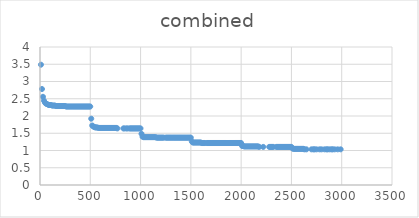
| Category | Series 0 |
|---|---|
| 9.49 | 3.487 |
| 19.54 | 2.782 |
| 29.48 | 2.556 |
| 39.42 | 2.444 |
| 49.49 | 2.387 |
| 59.43 | 2.359 |
| 69.49 | 2.345 |
| 79.43 | 2.331 |
| 89.5 | 2.317 |
| 99.43 | 2.317 |
| 109.5 | 2.317 |
| 119.44 | 2.303 |
| 129.51 | 2.303 |
| 139.45 | 2.303 |
| 149.52 | 2.303 |
| 159.45 | 2.289 |
| 169.51 | 2.289 |
| 179.45 | 2.289 |
| 189.52 | 2.289 |
| 199.45 | 2.289 |
| 209.52 | 2.289 |
| 219.46 | 2.289 |
| 229.52 | 2.289 |
| 239.46 | 2.289 |
| 249.52 | 2.289 |
| 259.48 | 2.275 |
| 269.53 | 2.275 |
| 279.48 | 2.275 |
| 289.42 | 2.275 |
| 299.48 | 2.275 |
| 309.42 | 2.275 |
| 319.49 | 2.275 |
| 329.42 | 2.275 |
| 339.49 | 2.275 |
| 349.42 | 2.275 |
| 359.5 | 2.275 |
| 369.43 | 2.275 |
| 379.5 | 2.275 |
| 389.43 | 2.275 |
| 399.5 | 2.275 |
| 409.44 | 2.275 |
| 419.51 | 2.275 |
| 429.45 | 2.275 |
| 439.51 | 2.275 |
| 449.45 | 2.275 |
| 459.51 | 2.275 |
| 469.45 | 2.275 |
| 479.52 | 2.275 |
| 489.46 | 2.275 |
| 499.53 | 2.275 |
| 509.44 | 1.922 |
| 519.43 | 1.725 |
| 529.43 | 1.696 |
| 539.45 | 1.682 |
| 549.46 | 1.668 |
| 559.41 | 1.668 |
| 569.42 | 1.668 |
| 579.43 | 1.654 |
| 589.45 | 1.654 |
| 599.45 | 1.654 |
| 609.47 | 1.654 |
| 619.41 | 1.654 |
| 629.43 | 1.654 |
| 639.44 | 1.654 |
| 649.46 | 1.654 |
| 659.46 | 1.654 |
| 669.48 | 1.654 |
| 679.43 | 1.654 |
| 689.45 | 1.654 |
| 699.45 | 1.654 |
| 709.47 | 1.654 |
| 719.41 | 1.654 |
| 729.43 | 1.654 |
| 739.45 | 1.654 |
| 749.45 | 1.654 |
| 759.47 | 1.654 |
| 769.41 | 1.64 |
| 829.43 | 1.64 |
| 839.44 | 1.64 |
| 859.46 | 1.64 |
| 869.42 | 1.64 |
| 889.44 | 1.64 |
| 899.47 | 1.64 |
| 909.46 | 1.64 |
| 919.41 | 1.64 |
| 929.43 | 1.64 |
| 939.44 | 1.64 |
| 949.45 | 1.64 |
| 959.46 | 1.64 |
| 969.41 | 1.64 |
| 979.42 | 1.64 |
| 989.44 | 1.64 |
| 999.44 | 1.64 |
| 1009.44 | 1.485 |
| 1019.42 | 1.4 |
| 1029.45 | 1.386 |
| 1039.41 | 1.386 |
| 1049.44 | 1.386 |
| 1059.44 | 1.386 |
| 1069.47 | 1.386 |
| 1079.42 | 1.386 |
| 1089.41 | 1.386 |
| 1099.41 | 1.386 |
| 1109.41 | 1.386 |
| 1119.43 | 1.386 |
| 1129.44 | 1.386 |
| 1139.44 | 1.386 |
| 1149.43 | 1.386 |
| 1159.41 | 1.372 |
| 1169.41 | 1.372 |
| 1179.45 | 1.372 |
| 1189.44 | 1.372 |
| 1199.44 | 1.372 |
| 1209.43 | 1.372 |
| 1219.43 | 1.372 |
| 1229.42 | 1.372 |
| 1249.41 | 1.372 |
| 1259.45 | 1.372 |
| 1269.45 | 1.372 |
| 1279.44 | 1.372 |
| 1289.43 | 1.372 |
| 1299.43 | 1.372 |
| 1309.42 | 1.372 |
| 1319.46 | 1.372 |
| 1329.45 | 1.372 |
| 1339.44 | 1.372 |
| 1349.44 | 1.372 |
| 1359.44 | 1.372 |
| 1369.43 | 1.372 |
| 1379.43 | 1.372 |
| 1389.41 | 1.372 |
| 1399.41 | 1.372 |
| 1409.44 | 1.372 |
| 1419.44 | 1.372 |
| 1429.43 | 1.372 |
| 1439.43 | 1.372 |
| 1449.42 | 1.372 |
| 1459.41 | 1.372 |
| 1469.42 | 1.372 |
| 1479.46 | 1.372 |
| 1489.41 | 1.372 |
| 1499.44 | 1.372 |
| 1509.43 | 1.259 |
| 1519.42 | 1.231 |
| 1529.41 | 1.231 |
| 1539.43 | 1.231 |
| 1549.46 | 1.231 |
| 1559.41 | 1.231 |
| 1569.42 | 1.231 |
| 1579.4 | 1.231 |
| 1589.42 | 1.231 |
| 1599.41 | 1.231 |
| 1609.43 | 1.217 |
| 1619.41 | 1.217 |
| 1629.4 | 1.217 |
| 1639.42 | 1.217 |
| 1659.43 | 1.217 |
| 1669.43 | 1.217 |
| 1679.43 | 1.217 |
| 1689.41 | 1.217 |
| 1699.42 | 1.217 |
| 1709.41 | 1.217 |
| 1719.42 | 1.217 |
| 1729.41 | 1.217 |
| 1739.42 | 1.217 |
| 1749.42 | 1.217 |
| 1759.43 | 1.217 |
| 1769.42 | 1.217 |
| 1779.44 | 1.217 |
| 1789.42 | 1.217 |
| 1799.44 | 1.217 |
| 1809.43 | 1.217 |
| 1819.41 | 1.217 |
| 1829.43 | 1.217 |
| 1839.42 | 1.217 |
| 1849.42 | 1.217 |
| 1859.41 | 1.217 |
| 1869.42 | 1.217 |
| 1879.42 | 1.217 |
| 1889.44 | 1.217 |
| 1899.43 | 1.217 |
| 1909.4 | 1.217 |
| 1919.42 | 1.217 |
| 1929.42 | 1.217 |
| 1939.42 | 1.217 |
| 1949.42 | 1.217 |
| 1959.44 | 1.217 |
| 1969.41 | 1.217 |
| 1979.4 | 1.217 |
| 1989.43 | 1.217 |
| 1999.4 | 1.217 |
| 2009.41 | 1.132 |
| 2019.42 | 1.132 |
| 2029.43 | 1.118 |
| 2039.42 | 1.118 |
| 2049.39 | 1.118 |
| 2059.4 | 1.118 |
| 2069.42 | 1.118 |
| 2079.41 | 1.118 |
| 2089.41 | 1.118 |
| 2099.42 | 1.118 |
| 2109.4 | 1.118 |
| 2119.42 | 1.118 |
| 2129.4 | 1.118 |
| 2139.41 | 1.118 |
| 2149.42 | 1.118 |
| 2159.4 | 1.118 |
| 2169.41 | 1.118 |
| 2179.4 | 1.104 |
| 2219.41 | 1.104 |
| 2279.42 | 1.104 |
| 2289.41 | 1.104 |
| 2299.41 | 1.104 |
| 2309.4 | 1.104 |
| 2319.41 | 1.104 |
| 2349.42 | 1.104 |
| 2359.43 | 1.104 |
| 2369.41 | 1.104 |
| 2379.4 | 1.104 |
| 2389.4 | 1.104 |
| 2399.42 | 1.104 |
| 2409.42 | 1.104 |
| 2419.4 | 1.104 |
| 2429.39 | 1.104 |
| 2439.41 | 1.104 |
| 2449.42 | 1.104 |
| 2459.42 | 1.104 |
| 2469.41 | 1.104 |
| 2479.41 | 1.104 |
| 2489.4 | 1.104 |
| 2499.39 | 1.104 |
| 2509.41 | 1.062 |
| 2519.41 | 1.048 |
| 2529.39 | 1.048 |
| 2539.4 | 1.048 |
| 2549.41 | 1.048 |
| 2559.42 | 1.048 |
| 2569.41 | 1.048 |
| 2579.4 | 1.048 |
| 2589.4 | 1.048 |
| 2599.4 | 1.048 |
| 2609.41 | 1.048 |
| 2619.41 | 1.048 |
| 2629.41 | 1.034 |
| 2649.39 | 1.034 |
| 2699.42 | 1.034 |
| 2719.4 | 1.034 |
| 2729.4 | 1.034 |
| 2749.4 | 1.034 |
| 2779.39 | 1.034 |
| 2799.41 | 1.034 |
| 2829.4 | 1.034 |
| 2849.4 | 1.034 |
| 2859.4 | 1.034 |
| 2879.4 | 1.034 |
| 2899.41 | 1.034 |
| 2909.41 | 1.034 |
| 2929.42 | 1.034 |
| 2959.39 | 1.034 |
| 2989.4 | 1.034 |